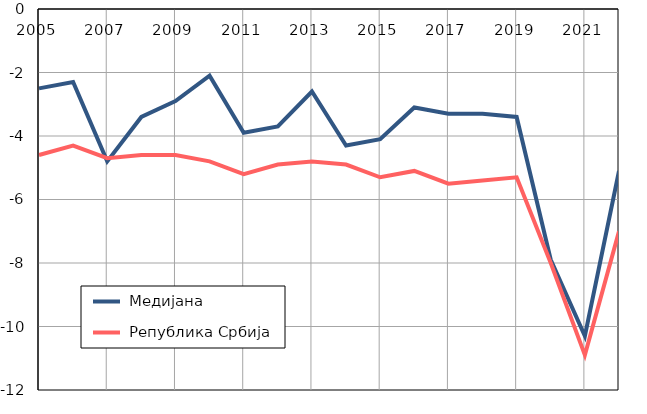
| Category |  Медијана |  Република Србија |
|---|---|---|
| 2005.0 | -2.5 | -4.6 |
| 2006.0 | -2.3 | -4.3 |
| 2007.0 | -4.8 | -4.7 |
| 2008.0 | -3.4 | -4.6 |
| 2009.0 | -2.9 | -4.6 |
| 2010.0 | -2.1 | -4.8 |
| 2011.0 | -3.9 | -5.2 |
| 2012.0 | -3.7 | -4.9 |
| 2013.0 | -2.6 | -4.8 |
| 2014.0 | -4.3 | -4.9 |
| 2015.0 | -4.1 | -5.3 |
| 2016.0 | -3.1 | -5.1 |
| 2017.0 | -3.3 | -5.5 |
| 2018.0 | -3.3 | -5.4 |
| 2019.0 | -3.4 | -5.3 |
| 2020.0 | -7.9 | -8 |
| 2021.0 | -10.3 | -10.9 |
| 2022.0 | -5.1 | -7 |